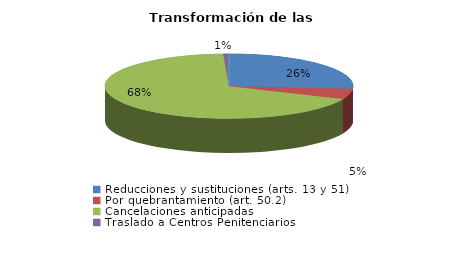
| Category | Series 0 |
|---|---|
| Reducciones y sustituciones (arts. 13 y 51) | 35 |
| Por quebrantamiento (art. 50.2) | 7 |
| Cancelaciones anticipadas | 90 |
| Traslado a Centros Penitenciarios | 1 |
| Conversión internamientos en cerrados (art. 51.2) | 0 |